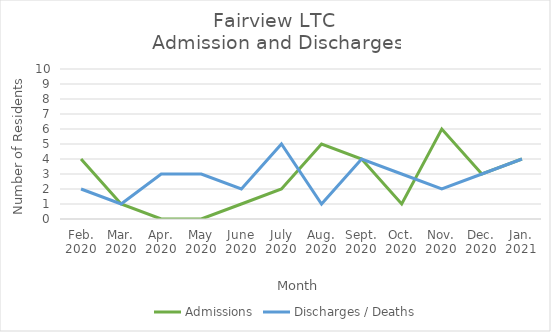
| Category | Admissions | Discharges / Deaths |
|---|---|---|
| Feb.
2020 | 4 | 2 |
| Mar.
2020 | 1 | 1 |
| Apr.
2020 | 0 | 3 |
| May
2020 | 0 | 3 |
| June
2020 | 1 | 2 |
| July
2020 | 2 | 5 |
| Aug.
2020 | 5 | 1 |
| Sept.
2020 | 4 | 4 |
| Oct.
2020 | 1 | 3 |
| Nov.
2020 | 6 | 2 |
| Dec.
2020 | 3 | 3 |
| Jan.
2021 | 4 | 4 |